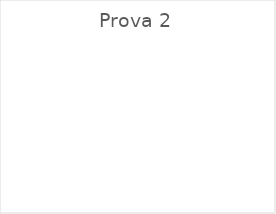
| Category | Series 0 |
|---|---|
| Errate | 0 |
| Corrette | 0 |